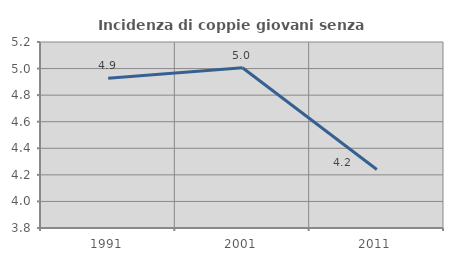
| Category | Incidenza di coppie giovani senza figli |
|---|---|
| 1991.0 | 4.928 |
| 2001.0 | 5.006 |
| 2011.0 | 4.24 |